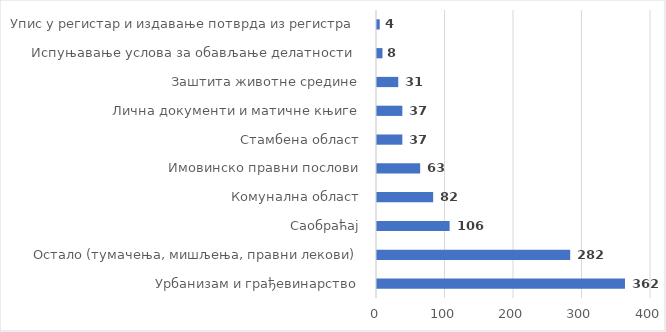
| Category | Series 0 |
|---|---|
| Урбанизам и грађевинарство | 362 |
| Остало (тумачења, мишљења, правни лекови) | 282 |
| Саобраћај | 106 |
| Комунална област | 82 |
| Имовинско правни послови | 63 |
| Стамбена област | 37 |
| Лична документи и матичне књиге | 37 |
| Заштита животне средине | 31 |
| Испуњавање услова за обављање делатности  | 8 |
| Упис у регистар и издавање потврда из регистра | 4 |